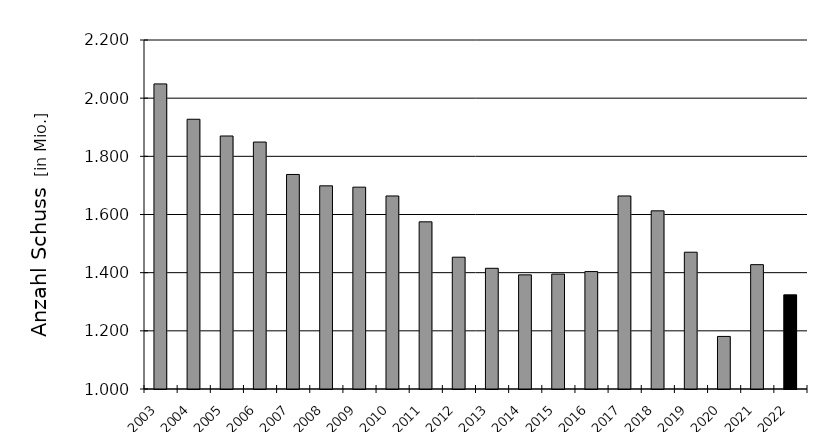
| Category | Anzahl Schuss                  [Mio] |
|---|---|
| 2003.0 | 2.049 |
| 2004.0 | 1.927 |
| 2005.0 | 1.87 |
| 2006.0 | 1.849 |
| 2007.0 | 1.738 |
| 2008.0 | 1.699 |
| 2009.0 | 1.694 |
| 2010.0 | 1.664 |
| 2011.0 | 1.575 |
| 2012.0 | 1.453 |
| 2013.0 | 1.415 |
| 2014.0 | 1.392 |
| 2015.0 | 1.395 |
| 2016.0 | 1.404 |
| 2017.0 | 1.664 |
| 2018.0 | 1.613 |
| 2019.0 | 1.47 |
| 2020.0 | 1.181 |
| 2021.0 | 1.428 |
| 2022.0 | 1.324 |